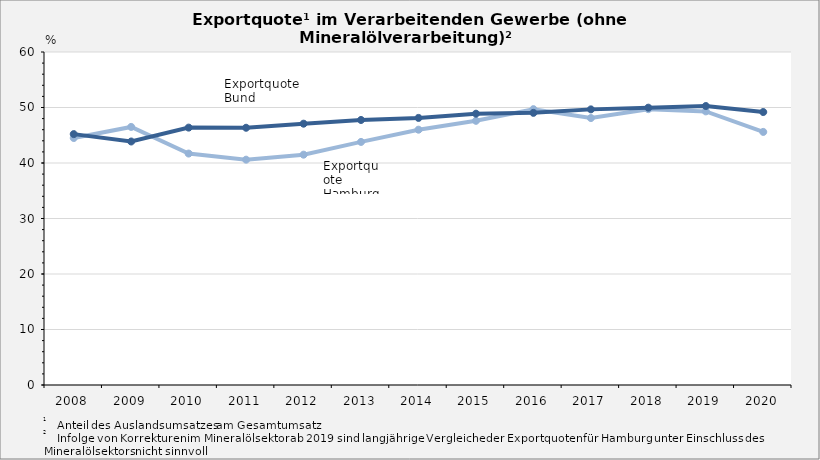
| Category | Exportquote Hamburg | Exportquote Bund |
|---|---|---|
| 2008.0 | 44.5 | 45.205 |
| 2009.0 | 46.5 | 43.874 |
| 2010.0 | 41.7 | 46.374 |
| 2011.0 | 40.6 | 46.35 |
| 2012.0 | 41.5 | 47.082 |
| 2013.0 | 43.8 | 47.753 |
| 2014.0 | 46 | 48.123 |
| 2015.0 | 47.6 | 48.885 |
| 2016.0 | 49.7 | 49.034 |
| 2017.0 | 48.1 | 49.662 |
| 2018.0 | 49.7 | 49.968 |
| 2019.0 | 49.3 | 50.264 |
| 2020.0 | 45.6 | 49.181 |